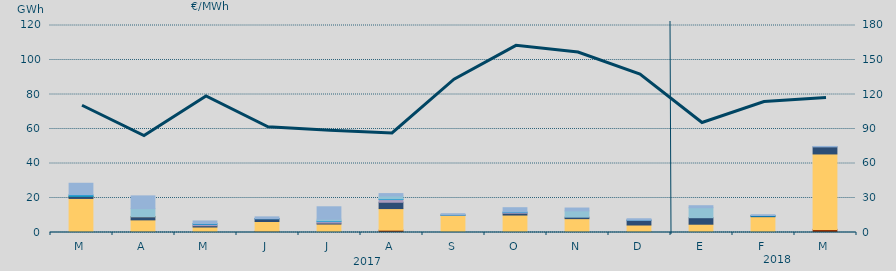
| Category | Carbón | Ciclo Combinado | Cogeneración | Consumo Bombeo | Enlace Península Baleares | Eólica | Hidráulica | Internacionales | Otras Renovables | Residuos no Renovables | Solar fotovoltaica | Turbinación bombeo |
|---|---|---|---|---|---|---|---|---|---|---|---|---|
| M | 0 | 19740.7 | 0 | 1177.9 | 20.4 | 43.7 | 849.6 | 0 | 0 | 0 | 0 | 6709.7 |
| A | 610 | 6714.7 | 0 | 1740 | 132.6 | 93.7 | 0 | 4549.7 | 0 | 0 | 0 | 7385.9 |
| M | 70 | 3116.9 | 0 | 762.7 | 846.6 | 0 | 410 | 0 | 0 | 0 | 0 | 1489.3 |
| J | 673.2 | 5702.5 | 0 | 1567.6 | 28.4 | 0 | 149.4 | 0 | 0 | 0 | 0 | 940.1 |
| J | 0 | 4906.7 | 0 | 593.2 | 844.1 | 0 | 376.7 | 973.2 | 0 | 0 | 0 | 7214.8 |
| A | 1372.5 | 12488.5 | 0 | 3675.7 | 1561.2 | 0 | 359.5 | 1700.4 | 0 | 0 | 0 | 1397.9 |
| S | 0 | 9962.3 | 0 | 123.8 | 0 | 0 | 40 | 0 | 0 | 0 | 0 | 759.3 |
| O | 0 | 10119.2 | 0 | 1038.2 | 495.2 | 0 | 208.4 | 0 | 0 | 0 | 0 | 2510.5 |
| N | 0 | 8034.3 | 0 | 863.8 | 0 | 0 | 0 | 3635.7 | 0 | 0 | 0 | 1650.6 |
| D | 374 | 3967.2 | 0 | 2746.1 | 58.6 | 0 | 52.1 | 0 | 0 | 0 | 0 | 774.9 |
| E | 0 | 4799.8 | 0 | 3776.1 | 0 | 0 | 0 | 5766.5 | 0 | 0 | 0 | 1181.9 |
| F | 0 | 9167.2 | 0 | 319.8 | 0 | 0 | 367.5 | 0 | 0 | 0 | 0 | 436 |
| M | 1806.7 | 43724.8 | 0 | 4108.1 | 0 | 0 | 0 | 0 | 0 | 0 | 0 | 249 |